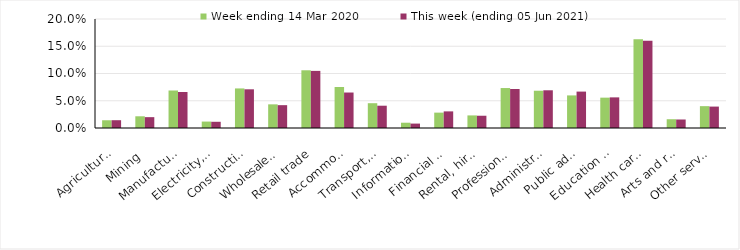
| Category | Week ending 14 Mar 2020 | This week (ending 05 Jun 2021) |
|---|---|---|
| Agriculture, forestry and fishing | 0.014 | 0.014 |
| Mining | 0.022 | 0.02 |
| Manufacturing | 0.069 | 0.066 |
| Electricity, gas, water and waste services | 0.012 | 0.011 |
| Construction | 0.073 | 0.071 |
| Wholesale trade | 0.043 | 0.042 |
| Retail trade | 0.106 | 0.105 |
| Accommodation and food services | 0.075 | 0.065 |
| Transport, postal and warehousing | 0.046 | 0.041 |
| Information media and telecommunications | 0.01 | 0.008 |
| Financial and insurance services | 0.028 | 0.03 |
| Rental, hiring and real estate services | 0.023 | 0.022 |
| Professional, scientific and technical services | 0.073 | 0.072 |
| Administrative and support services | 0.068 | 0.069 |
| Public administration and safety | 0.06 | 0.067 |
| Education and training | 0.056 | 0.056 |
| Health care and social assistance | 0.163 | 0.16 |
| Arts and recreation services | 0.016 | 0.016 |
| Other services | 0.04 | 0.039 |